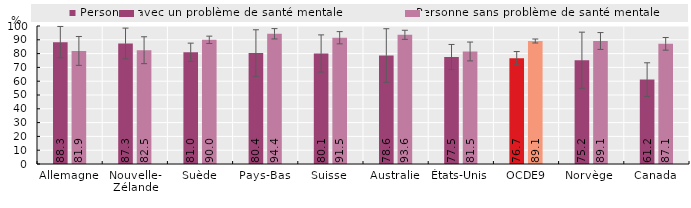
| Category | Personne avec un problème de santé mentale | Personne sans problème de santé mentale |
|---|---|---|
| Allemagne | 88.305 | 81.936 |
| Nouvelle-
Zélande | 87.335 | 82.452 |
| Suède | 80.976 | 89.987 |
| Pays-Bas | 80.403 | 94.368 |
| Suisse | 80.074 | 91.497 |
| Australie | 78.616 | 93.62 |
| États-Unis | 77.508 | 81.542 |
| OCDE9 | 76.652 | 89.136 |
| Norvège  | 75.21 | 89.136 |
| Canada | 61.163 | 87.078 |